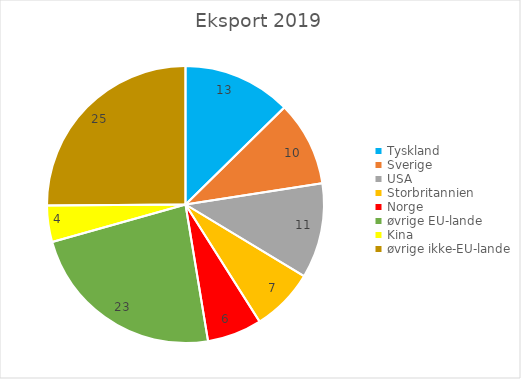
| Category | Eksport 2019 |
|---|---|
| Tyskland | 12.638 |
| Sverige | 9.905 |
| USA | 11.112 |
| Storbritannien | 7.368 |
| Norge | 6.372 |
| øvrige EU-lande | 23.242 |
| Kina | 4.237 |
| øvrige ikke-EU-lande | 25.127 |